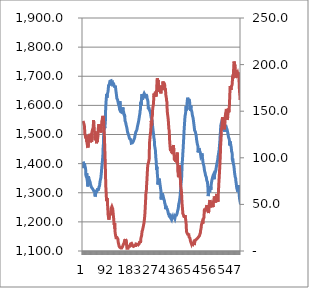
| Category | Series 0 |
|---|---|
| 0 | 1383.896 |
| 1 | 1406.212 |
| 2 | 1403.103 |
| 3 | 1395.342 |
| 4 | 1400.857 |
| 5 | 1397.464 |
| 6 | 1394.062 |
| 7 | 1392.639 |
| 8 | 1387.001 |
| 9 | 1381.677 |
| 10 | 1360.082 |
| 11 | 1362.722 |
| 12 | 1353.186 |
| 13 | 1366.427 |
| 14 | 1367.484 |
| 15 | 1344.012 |
| 16 | 1342.805 |
| 17 | 1321.585 |
| 18 | 1333.597 |
| 19 | 1356.39 |
| 20 | 1355.257 |
| 21 | 1349.046 |
| 22 | 1346.692 |
| 23 | 1342.982 |
| 24 | 1340.26 |
| 25 | 1338.157 |
| 26 | 1334.182 |
| 27 | 1328.136 |
| 28 | 1325.779 |
| 29 | 1323.043 |
| 30 | 1319.455 |
| 31 | 1317.008 |
| 32 | 1318.854 |
| 33 | 1319.34 |
| 34 | 1314.361 |
| 35 | 1311.308 |
| 36 | 1311.388 |
| 37 | 1309.599 |
| 38 | 1306.169 |
| 39 | 1305.646 |
| 40 | 1304.491 |
| 41 | 1307.121 |
| 42 | 1302.709 |
| 43 | 1304.869 |
| 44 | 1287.106 |
| 45 | 1304.857 |
| 46 | 1307.063 |
| 47 | 1300.279 |
| 48 | 1304.037 |
| 49 | 1299.836 |
| 50 | 1307.312 |
| 51 | 1305.934 |
| 52 | 1307.138 |
| 53 | 1314.257 |
| 54 | 1307.439 |
| 55 | 1314.925 |
| 56 | 1310.176 |
| 57 | 1315.434 |
| 58 | 1319.986 |
| 59 | 1319.561 |
| 60 | 1323.579 |
| 61 | 1332.529 |
| 62 | 1339.87 |
| 63 | 1344.694 |
| 64 | 1345.571 |
| 65 | 1352.568 |
| 66 | 1363.924 |
| 67 | 1372.537 |
| 68 | 1387.621 |
| 69 | 1394.839 |
| 70 | 1404.566 |
| 71 | 1416.404 |
| 72 | 1427.493 |
| 73 | 1453.933 |
| 74 | 1466.186 |
| 75 | 1499.87 |
| 76 | 1499.257 |
| 77 | 1518.988 |
| 78 | 1531.365 |
| 79 | 1521.556 |
| 80 | 1554.118 |
| 81 | 1546.306 |
| 82 | 1580.745 |
| 83 | 1601.989 |
| 84 | 1616.77 |
| 85 | 1619.927 |
| 86 | 1639.492 |
| 87 | 1626.838 |
| 88 | 1636.803 |
| 89 | 1638.716 |
| 90 | 1644.017 |
| 91 | 1648.784 |
| 92 | 1659.015 |
| 93 | 1668.957 |
| 94 | 1670.729 |
| 95 | 1671.532 |
| 96 | 1673.133 |
| 97 | 1668.244 |
| 98 | 1682.872 |
| 99 | 1684.824 |
| 100 | 1683.598 |
| 101 | 1685.229 |
| 102 | 1684.456 |
| 103 | 1678.148 |
| 104 | 1679.084 |
| 105 | 1675.826 |
| 106 | 1675.122 |
| 107 | 1679.743 |
| 108 | 1670.773 |
| 109 | 1671.874 |
| 110 | 1671.993 |
| 111 | 1671.738 |
| 112 | 1672.333 |
| 113 | 1671.957 |
| 114 | 1664.956 |
| 115 | 1664.107 |
| 116 | 1662.596 |
| 117 | 1662.057 |
| 118 | 1664.317 |
| 119 | 1661.135 |
| 120 | 1647.606 |
| 121 | 1641.268 |
| 122 | 1633.494 |
| 123 | 1624.661 |
| 124 | 1621.417 |
| 125 | 1621.469 |
| 126 | 1618.422 |
| 127 | 1613.499 |
| 128 | 1611.976 |
| 129 | 1605.328 |
| 130 | 1600.893 |
| 131 | 1602.222 |
| 132 | 1594.796 |
| 133 | 1586.341 |
| 134 | 1614.955 |
| 135 | 1582.447 |
| 136 | 1580.577 |
| 137 | 1578.021 |
| 138 | 1577.743 |
| 139 | 1579.049 |
| 140 | 1577.071 |
| 141 | 1575.972 |
| 142 | 1577.804 |
| 143 | 1579.847 |
| 144 | 1576.646 |
| 145 | 1593.15 |
| 146 | 1583.957 |
| 147 | 1582.513 |
| 148 | 1576.97 |
| 149 | 1572.301 |
| 150 | 1565.296 |
| 151 | 1569.194 |
| 152 | 1560.354 |
| 153 | 1547.653 |
| 154 | 1546.519 |
| 155 | 1542.156 |
| 156 | 1538.33 |
| 157 | 1532.737 |
| 158 | 1532.576 |
| 159 | 1525.51 |
| 160 | 1521.114 |
| 161 | 1515.494 |
| 162 | 1508.844 |
| 163 | 1507.37 |
| 164 | 1505.422 |
| 165 | 1501.009 |
| 166 | 1497.494 |
| 167 | 1494.909 |
| 168 | 1491.643 |
| 169 | 1486.828 |
| 170 | 1486.056 |
| 171 | 1485.713 |
| 172 | 1488.045 |
| 173 | 1483.33 |
| 174 | 1481.697 |
| 175 | 1475.511 |
| 176 | 1470.172 |
| 177 | 1472.499 |
| 178 | 1470.106 |
| 179 | 1471.896 |
| 180 | 1471.369 |
| 181 | 1470.357 |
| 182 | 1468.286 |
| 183 | 1471.339 |
| 184 | 1477.798 |
| 185 | 1475.983 |
| 186 | 1483.657 |
| 187 | 1483.273 |
| 188 | 1488.019 |
| 189 | 1494.582 |
| 190 | 1497.919 |
| 191 | 1494.87 |
| 192 | 1507.476 |
| 193 | 1505.344 |
| 194 | 1504.6 |
| 195 | 1510.591 |
| 196 | 1515.877 |
| 197 | 1519.824 |
| 198 | 1525.948 |
| 199 | 1525.488 |
| 200 | 1534.472 |
| 201 | 1534.695 |
| 202 | 1542.669 |
| 203 | 1542.375 |
| 204 | 1553.458 |
| 205 | 1559.278 |
| 206 | 1566.359 |
| 207 | 1569.947 |
| 208 | 1581.064 |
| 209 | 1584.515 |
| 210 | 1610.642 |
| 211 | 1611.825 |
| 212 | 1599.511 |
| 213 | 1623.165 |
| 214 | 1630.047 |
| 215 | 1638.483 |
| 216 | 1639.797 |
| 217 | 1620.127 |
| 218 | 1624.517 |
| 219 | 1621.439 |
| 220 | 1632.511 |
| 221 | 1636.501 |
| 222 | 1635.742 |
| 223 | 1641.043 |
| 224 | 1643.125 |
| 225 | 1640.995 |
| 226 | 1638.203 |
| 227 | 1633.857 |
| 228 | 1624.668 |
| 229 | 1637.992 |
| 230 | 1639.285 |
| 231 | 1634.903 |
| 232 | 1637.075 |
| 233 | 1630.135 |
| 234 | 1622.847 |
| 235 | 1625.883 |
| 236 | 1616.751 |
| 237 | 1609.125 |
| 238 | 1589.061 |
| 239 | 1594.135 |
| 240 | 1596.533 |
| 241 | 1586.035 |
| 242 | 1585.122 |
| 243 | 1584.291 |
| 244 | 1580.229 |
| 245 | 1578.753 |
| 246 | 1574.116 |
| 247 | 1571.619 |
| 248 | 1560.496 |
| 249 | 1561.527 |
| 250 | 1551.544 |
| 251 | 1548.809 |
| 252 | 1548.069 |
| 253 | 1536.451 |
| 254 | 1525.252 |
| 255 | 1518.134 |
| 256 | 1508.309 |
| 257 | 1503.182 |
| 258 | 1491.449 |
| 259 | 1489.929 |
| 260 | 1480.844 |
| 261 | 1461.994 |
| 262 | 1458.966 |
| 263 | 1451.019 |
| 264 | 1444.738 |
| 265 | 1427.291 |
| 266 | 1414.48 |
| 267 | 1407.854 |
| 268 | 1378.832 |
| 269 | 1389.96 |
| 270 | 1379.697 |
| 271 | 1364.92 |
| 272 | 1353.548 |
| 273 | 1328.204 |
| 274 | 1334.751 |
| 275 | 1333.69 |
| 276 | 1330.921 |
| 277 | 1348.061 |
| 278 | 1345.327 |
| 279 | 1341.588 |
| 280 | 1334.26 |
| 281 | 1326.852 |
| 282 | 1321.001 |
| 283 | 1313.199 |
| 284 | 1306.779 |
| 285 | 1276.634 |
| 286 | 1289.498 |
| 287 | 1283.16 |
| 288 | 1279.851 |
| 289 | 1298.191 |
| 290 | 1294.266 |
| 291 | 1290.912 |
| 292 | 1290.015 |
| 293 | 1284.744 |
| 294 | 1282.185 |
| 295 | 1277.744 |
| 296 | 1275.449 |
| 297 | 1271.271 |
| 298 | 1263.731 |
| 299 | 1264.599 |
| 300 | 1260 |
| 301 | 1243.755 |
| 302 | 1255.349 |
| 303 | 1247.704 |
| 304 | 1250.626 |
| 305 | 1248.486 |
| 306 | 1246.684 |
| 307 | 1243.97 |
| 308 | 1240.974 |
| 309 | 1237.835 |
| 310 | 1236.071 |
| 311 | 1229.911 |
| 312 | 1224.723 |
| 313 | 1229.124 |
| 314 | 1229.872 |
| 315 | 1218.96 |
| 316 | 1219.666 |
| 317 | 1217.777 |
| 318 | 1215.852 |
| 319 | 1214.268 |
| 320 | 1213.782 |
| 321 | 1213.735 |
| 322 | 1209.193 |
| 323 | 1215.127 |
| 324 | 1216.787 |
| 325 | 1211.417 |
| 326 | 1213.732 |
| 327 | 1216.551 |
| 328 | 1212.4 |
| 329 | 1218.431 |
| 330 | 1210.358 |
| 331 | 1212.725 |
| 332 | 1212.247 |
| 333 | 1217.262 |
| 334 | 1214.562 |
| 335 | 1212.159 |
| 336 | 1216.803 |
| 337 | 1221.76 |
| 338 | 1222.938 |
| 339 | 1219.624 |
| 340 | 1224.997 |
| 341 | 1223.114 |
| 342 | 1224.615 |
| 343 | 1228.46 |
| 344 | 1229.015 |
| 345 | 1237.612 |
| 346 | 1234.52 |
| 347 | 1244.537 |
| 348 | 1251.32 |
| 349 | 1261.183 |
| 350 | 1263.691 |
| 351 | 1267.042 |
| 352 | 1274.422 |
| 353 | 1280.703 |
| 354 | 1286.1 |
| 355 | 1300.9 |
| 356 | 1309.515 |
| 357 | 1327.882 |
| 358 | 1334.437 |
| 359 | 1344.355 |
| 360 | 1356.772 |
| 361 | 1387.146 |
| 362 | 1403.63 |
| 363 | 1415.811 |
| 364 | 1434.536 |
| 365 | 1447.007 |
| 366 | 1465.538 |
| 367 | 1483.479 |
| 368 | 1499.574 |
| 369 | 1518.675 |
| 370 | 1533.311 |
| 371 | 1548.593 |
| 372 | 1561.838 |
| 373 | 1562.711 |
| 374 | 1572.782 |
| 375 | 1582.172 |
| 376 | 1596.853 |
| 377 | 1582.661 |
| 378 | 1587.381 |
| 379 | 1595.505 |
| 380 | 1614.978 |
| 381 | 1618.319 |
| 382 | 1626.309 |
| 383 | 1622.967 |
| 384 | 1628.948 |
| 385 | 1607.003 |
| 386 | 1621.701 |
| 387 | 1620.915 |
| 388 | 1620.167 |
| 389 | 1611.585 |
| 390 | 1585.542 |
| 391 | 1590.614 |
| 392 | 1582.212 |
| 393 | 1599.368 |
| 394 | 1591.976 |
| 395 | 1583.835 |
| 396 | 1581.45 |
| 397 | 1578.55 |
| 398 | 1576.547 |
| 399 | 1565.976 |
| 400 | 1564.586 |
| 401 | 1558.702 |
| 402 | 1553.591 |
| 403 | 1546.422 |
| 404 | 1539.09 |
| 405 | 1537.331 |
| 406 | 1523.198 |
| 407 | 1514.195 |
| 408 | 1516.208 |
| 409 | 1513.942 |
| 410 | 1508.701 |
| 411 | 1503.824 |
| 412 | 1501.464 |
| 413 | 1495.64 |
| 414 | 1484.355 |
| 415 | 1478.765 |
| 416 | 1473.252 |
| 417 | 1466.954 |
| 418 | 1469.515 |
| 419 | 1460.768 |
| 420 | 1438.597 |
| 421 | 1440.101 |
| 422 | 1436.485 |
| 423 | 1452.959 |
| 424 | 1449.621 |
| 425 | 1449.699 |
| 426 | 1441.45 |
| 427 | 1438.907 |
| 428 | 1437.793 |
| 429 | 1436.282 |
| 430 | 1425.074 |
| 431 | 1427.388 |
| 432 | 1423.145 |
| 433 | 1430.533 |
| 434 | 1435.02 |
| 435 | 1423.993 |
| 436 | 1418.144 |
| 437 | 1410.131 |
| 438 | 1402.609 |
| 439 | 1398.779 |
| 440 | 1398.311 |
| 441 | 1391.077 |
| 442 | 1385.756 |
| 443 | 1377.177 |
| 444 | 1372.787 |
| 445 | 1372.673 |
| 446 | 1366.143 |
| 447 | 1359.519 |
| 448 | 1356.446 |
| 449 | 1357.422 |
| 450 | 1352.437 |
| 451 | 1344.899 |
| 452 | 1340.314 |
| 453 | 1337.903 |
| 454 | 1336.594 |
| 455 | 1336.218 |
| 456 | 1313.934 |
| 457 | 1288.495 |
| 458 | 1299.374 |
| 459 | 1303.7 |
| 460 | 1303.589 |
| 461 | 1302.54 |
| 462 | 1304.934 |
| 463 | 1304.9 |
| 464 | 1304.232 |
| 465 | 1322.823 |
| 466 | 1310.052 |
| 467 | 1321.932 |
| 468 | 1329.895 |
| 469 | 1331.54 |
| 470 | 1342.107 |
| 471 | 1340.262 |
| 472 | 1343.45 |
| 473 | 1353.578 |
| 474 | 1357.884 |
| 475 | 1361.285 |
| 476 | 1362.067 |
| 477 | 1364.248 |
| 478 | 1363.843 |
| 479 | 1346.427 |
| 480 | 1360.055 |
| 481 | 1365.178 |
| 482 | 1366.98 |
| 483 | 1371.565 |
| 484 | 1373.485 |
| 485 | 1379.146 |
| 486 | 1386.719 |
| 487 | 1392.173 |
| 488 | 1392.256 |
| 489 | 1401.394 |
| 490 | 1404.572 |
| 491 | 1411.288 |
| 492 | 1417.801 |
| 493 | 1426.646 |
| 494 | 1430.358 |
| 495 | 1437.513 |
| 496 | 1443.312 |
| 497 | 1447.519 |
| 498 | 1464.389 |
| 499 | 1471.228 |
| 500 | 1489.981 |
| 501 | 1503.211 |
| 502 | 1520.07 |
| 503 | 1532.489 |
| 504 | 1536.304 |
| 505 | 1538.211 |
| 506 | 1531.559 |
| 507 | 1539.559 |
| 508 | 1538.186 |
| 509 | 1534.361 |
| 510 | 1540.009 |
| 511 | 1535.737 |
| 512 | 1538.544 |
| 513 | 1537.671 |
| 514 | 1533.787 |
| 515 | 1531.728 |
| 516 | 1509.726 |
| 517 | 1529.151 |
| 518 | 1524.492 |
| 519 | 1526.019 |
| 520 | 1520.66 |
| 521 | 1517.241 |
| 522 | 1521.892 |
| 523 | 1524.714 |
| 524 | 1523.381 |
| 525 | 1523.279 |
| 526 | 1515.696 |
| 527 | 1511.181 |
| 528 | 1509.66 |
| 529 | 1501.469 |
| 530 | 1499.569 |
| 531 | 1490.457 |
| 532 | 1487.099 |
| 533 | 1485.977 |
| 534 | 1481.666 |
| 535 | 1462.371 |
| 536 | 1460.919 |
| 537 | 1475.486 |
| 538 | 1471.869 |
| 539 | 1464.651 |
| 540 | 1459.956 |
| 541 | 1456.276 |
| 542 | 1442.444 |
| 543 | 1441.929 |
| 544 | 1437.4 |
| 545 | 1413.605 |
| 546 | 1417.172 |
| 547 | 1407.091 |
| 548 | 1404.354 |
| 549 | 1398.258 |
| 550 | 1394.631 |
| 551 | 1388.405 |
| 552 | 1385.042 |
| 553 | 1368.852 |
| 554 | 1368.057 |
| 555 | 1355.297 |
| 556 | 1351.981 |
| 557 | 1349.008 |
| 558 | 1337.611 |
| 559 | 1333.072 |
| 560 | 1323.156 |
| 561 | 1315.921 |
| 562 | 1313.53 |
| 563 | 1309.501 |
| 564 | 1304.156 |
| 565 | 1322.25 |
| 566 | 1326.422 |
| 567 | 1319.539 |
| 568 | 1313.043 |
| 569 | 1304.241 |
| 570 | 1294.278 |
| 571 | 1281.046 |
| 572 | 1278.626 |
| 573 | 1278.669 |
| 574 | 1264.965 |
| 575 | 1260.037 |
| 576 | 1256.682 |